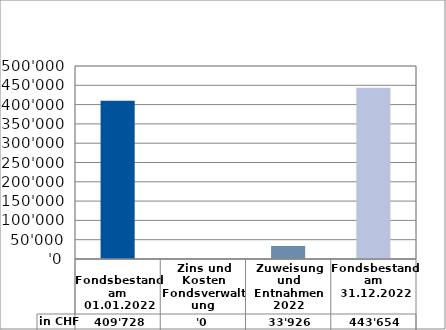
| Category | in CHF |
|---|---|
| 
Fondsbestand am 01.01.2022

 | 409728.1 |
| Zins und Kosten Fondsverwaltung | 0 |
| Zuweisung und Entnahmen 2022 | 33925.6 |
| Fondsbestand am 31.12.2022 | 443653.7 |